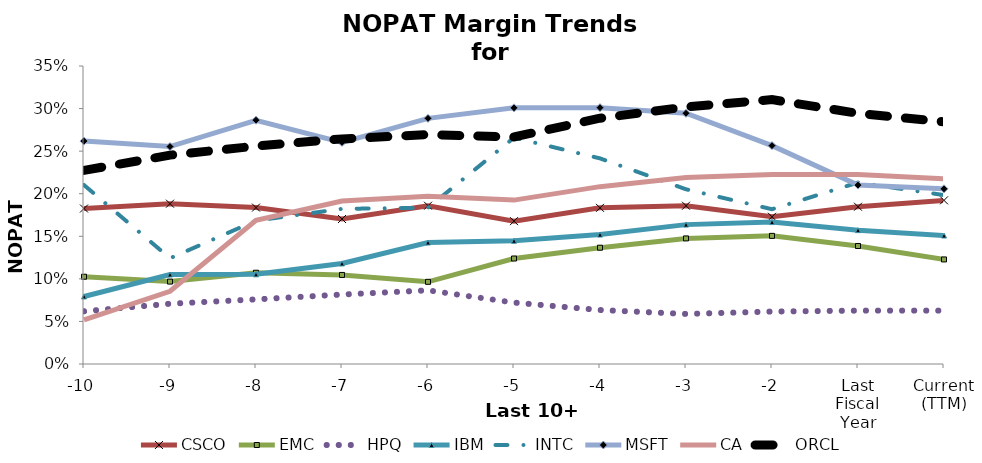
| Category | CSCO | EMC | HPQ | IBM | INTC | MSFT | CA | ORCL |
|---|---|---|---|---|---|---|---|---|
| -10 | 0.183 | 0.102 | 0.062 | 0.079 | 0.21 | 0.262 | 0.052 | 0.227 |
| -9 | 0.188 | 0.097 | 0.071 | 0.105 | 0.124 | 0.255 | 0.085 | 0.245 |
| -8 | 0.184 | 0.107 | 0.076 | 0.105 | 0.168 | 0.286 | 0.169 | 0.256 |
| -7 | 0.17 | 0.105 | 0.082 | 0.118 | 0.182 | 0.26 | 0.192 | 0.264 |
| -6 | 0.186 | 0.096 | 0.086 | 0.143 | 0.184 | 0.288 | 0.197 | 0.269 |
| -5 | 0.168 | 0.124 | 0.072 | 0.145 | 0.266 | 0.301 | 0.192 | 0.267 |
| -4 | 0.183 | 0.137 | 0.063 | 0.152 | 0.242 | 0.301 | 0.208 | 0.289 |
| -3 | 0.186 | 0.148 | 0.059 | 0.164 | 0.205 | 0.294 | 0.219 | 0.302 |
| -2 | 0.173 | 0.15 | 0.062 | 0.167 | 0.182 | 0.256 | 0.222 | 0.31 |
| Last Fiscal Year | 0.185 | 0.139 | 0.063 | 0.157 | 0.213 | 0.21 | 0.222 | 0.294 |
| Current (TTM) | 0.192 | 0.123 | 0.063 | 0.151 | 0.198 | 0.206 | 0.218 | 0.284 |